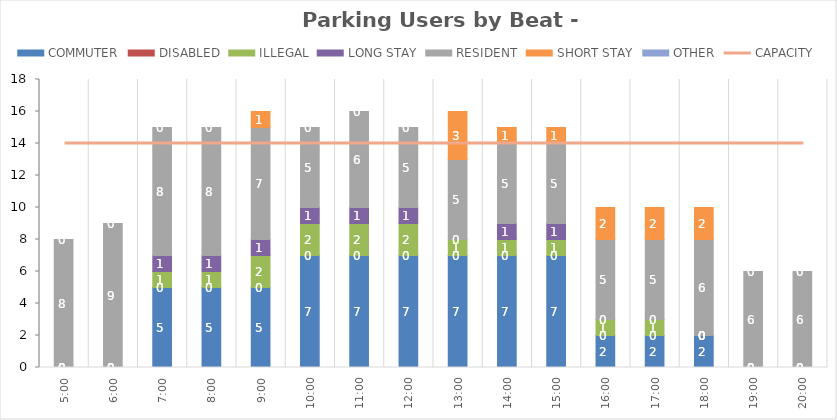
| Category | COMMUTER | DISABLED | ILLEGAL | LONG STAY | RESIDENT | SHORT STAY | OTHER |
|---|---|---|---|---|---|---|---|
| 0.20833333333333334 | 0 | 0 | 0 | 0 | 8 | 0 | 0 |
| 0.25 | 0 | 0 | 0 | 0 | 9 | 0 | 0 |
| 0.2916666666666667 | 5 | 0 | 1 | 1 | 8 | 0 | 0 |
| 0.3333333333333333 | 5 | 0 | 1 | 1 | 8 | 0 | 0 |
| 0.375 | 5 | 0 | 2 | 1 | 7 | 1 | 0 |
| 0.4166666666666667 | 7 | 0 | 2 | 1 | 5 | 0 | 0 |
| 0.4583333333333333 | 7 | 0 | 2 | 1 | 6 | 0 | 0 |
| 0.5 | 7 | 0 | 2 | 1 | 5 | 0 | 0 |
| 0.5416666666666666 | 7 | 0 | 1 | 0 | 5 | 3 | 0 |
| 0.5833333333333334 | 7 | 0 | 1 | 1 | 5 | 1 | 0 |
| 0.625 | 7 | 0 | 1 | 1 | 5 | 1 | 0 |
| 0.6666666666666666 | 2 | 0 | 1 | 0 | 5 | 2 | 0 |
| 0.7083333333333334 | 2 | 0 | 1 | 0 | 5 | 2 | 0 |
| 0.75 | 2 | 0 | 0 | 0 | 6 | 2 | 0 |
| 0.7916666666666666 | 0 | 0 | 0 | 0 | 6 | 0 | 0 |
| 0.8333333333333334 | 0 | 0 | 0 | 0 | 6 | 0 | 0 |